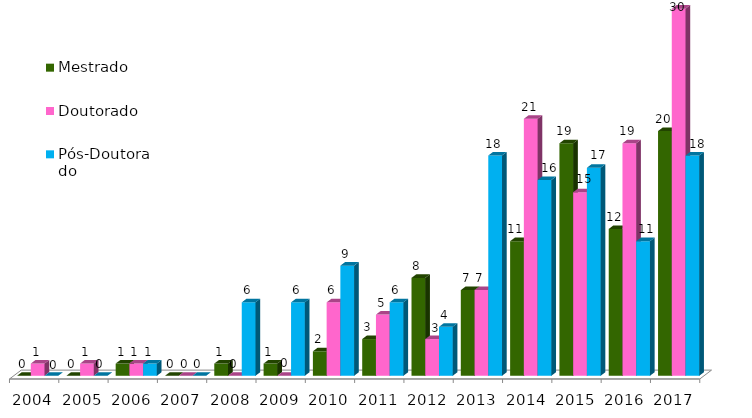
| Category | Mestrado | Doutorado  | Pós-Doutorado  |
|---|---|---|---|
| 2004.0 | 0 | 1 | 0 |
| 2005.0 | 0 | 1 | 0 |
| 2006.0 | 1 | 1 | 1 |
| 2007.0 | 0 | 0 | 0 |
| 2008.0 | 1 | 0 | 6 |
| 2009.0 | 1 | 0 | 6 |
| 2010.0 | 2 | 6 | 9 |
| 2011.0 | 3 | 5 | 6 |
| 2012.0 | 8 | 3 | 4 |
| 2013.0 | 7 | 7 | 18 |
| 2014.0 | 11 | 21 | 16 |
| 2015.0 | 19 | 15 | 17 |
| 2016.0 | 12 | 19 | 11 |
| 2017.0 | 20 | 30 | 18 |